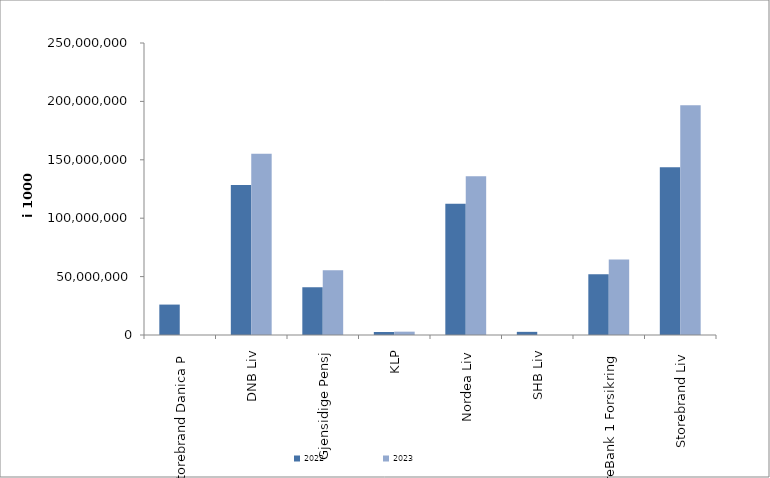
| Category | 2022 | 2023 |
|---|---|---|
| Storebrand Danica P | 26046630.69 | 0 |
| DNB Liv | 128365139 | 155131325 |
| Gjensidige Pensj | 40928356 | 55439027 |
| KLP | 2548669.298 | 2854115.915 |
| Nordea Liv | 112327400 | 135812760 |
| SHB Liv | 2698313.846 | 0 |
| SpareBank 1 Forsikring | 51982267.81 | 64667976.779 |
| Storebrand Liv | 143649383.581 | 196673849.634 |